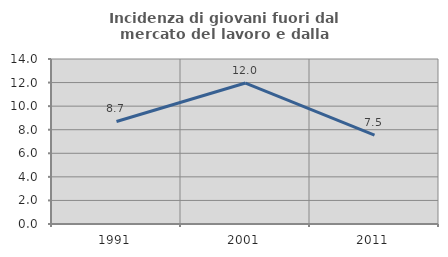
| Category | Incidenza di giovani fuori dal mercato del lavoro e dalla formazione  |
|---|---|
| 1991.0 | 8.699 |
| 2001.0 | 11.961 |
| 2011.0 | 7.536 |